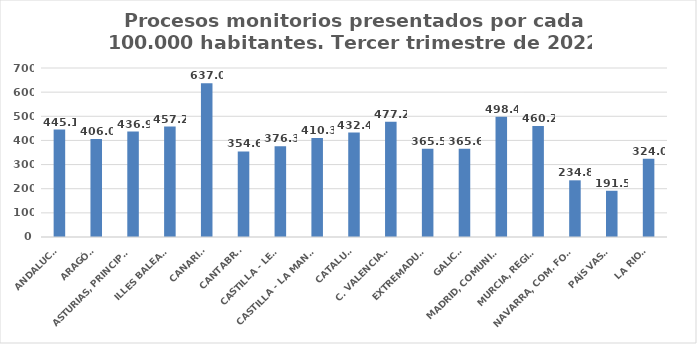
| Category | Series 0 |
|---|---|
| ANDALUCÍA | 445.088 |
| ARAGÓN | 406.008 |
| ASTURIAS, PRINCIPADO | 436.934 |
| ILLES BALEARS | 457.214 |
| CANARIAS | 636.966 |
| CANTABRIA | 354.566 |
| CASTILLA - LEÓN | 376.319 |
| CASTILLA - LA MANCHA | 410.342 |
| CATALUÑA | 432.426 |
| C. VALENCIANA | 477.23 |
| EXTREMADURA | 365.475 |
| GALICIA | 365.58 |
| MADRID, COMUNIDAD | 498.35 |
| MURCIA, REGIÓN | 460.221 |
| NAVARRA, COM. FORAL | 234.776 |
| PAÍS VASCO | 191.464 |
| LA RIOJA | 323.959 |